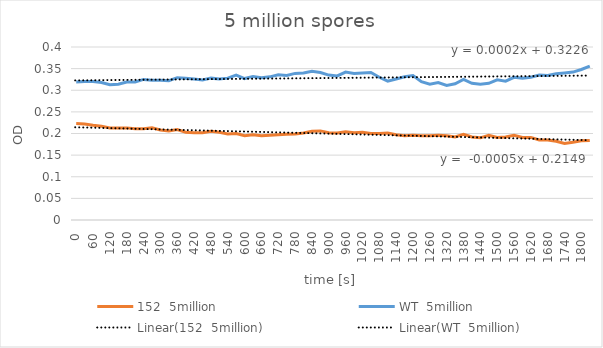
| Category | 152  5million | WT  5million |
|---|---|---|
| 0.0 | 0.223 | 0.319 |
| 30.0 | 0.222 | 0.32 |
| 60.0 | 0.219 | 0.32 |
| 90.0 | 0.217 | 0.318 |
| 120.0 | 0.213 | 0.313 |
| 150.0 | 0.213 | 0.314 |
| 180.0 | 0.213 | 0.319 |
| 210.0 | 0.211 | 0.319 |
| 240.0 | 0.211 | 0.325 |
| 270.0 | 0.213 | 0.323 |
| 300.0 | 0.208 | 0.323 |
| 330.0 | 0.206 | 0.322 |
| 360.0 | 0.209 | 0.329 |
| 390.0 | 0.203 | 0.328 |
| 420.0 | 0.202 | 0.326 |
| 450.0 | 0.202 | 0.324 |
| 480.0 | 0.205 | 0.328 |
| 510.0 | 0.203 | 0.326 |
| 540.0 | 0.199 | 0.328 |
| 570.0 | 0.2 | 0.335 |
| 600.0 | 0.195 | 0.327 |
| 630.0 | 0.197 | 0.332 |
| 660.0 | 0.195 | 0.329 |
| 690.0 | 0.196 | 0.331 |
| 720.0 | 0.197 | 0.336 |
| 750.0 | 0.198 | 0.334 |
| 780.0 | 0.199 | 0.339 |
| 810.0 | 0.201 | 0.34 |
| 840.0 | 0.205 | 0.344 |
| 870.0 | 0.206 | 0.341 |
| 900.0 | 0.202 | 0.335 |
| 930.0 | 0.201 | 0.333 |
| 960.0 | 0.204 | 0.342 |
| 990.0 | 0.202 | 0.339 |
| 1020.0 | 0.203 | 0.34 |
| 1050.0 | 0.2 | 0.341 |
| 1080.0 | 0.2 | 0.33 |
| 1110.0 | 0.201 | 0.321 |
| 1140.0 | 0.197 | 0.326 |
| 1170.0 | 0.195 | 0.331 |
| 1200.0 | 0.196 | 0.334 |
| 1230.0 | 0.195 | 0.32 |
| 1260.0 | 0.195 | 0.314 |
| 1290.0 | 0.196 | 0.318 |
| 1320.0 | 0.195 | 0.311 |
| 1350.0 | 0.192 | 0.315 |
| 1380.0 | 0.198 | 0.325 |
| 1410.0 | 0.192 | 0.316 |
| 1440.0 | 0.19 | 0.314 |
| 1470.0 | 0.196 | 0.316 |
| 1500.0 | 0.191 | 0.324 |
| 1530.0 | 0.192 | 0.321 |
| 1560.0 | 0.196 | 0.33 |
| 1590.0 | 0.191 | 0.328 |
| 1620.0 | 0.191 | 0.33 |
| 1650.0 | 0.185 | 0.335 |
| 1680.0 | 0.185 | 0.334 |
| 1710.0 | 0.182 | 0.338 |
| 1740.0 | 0.177 | 0.34 |
| 1770.0 | 0.18 | 0.342 |
| 1800.0 | 0.183 | 0.348 |
| 1830.0 | 0.184 | 0.356 |